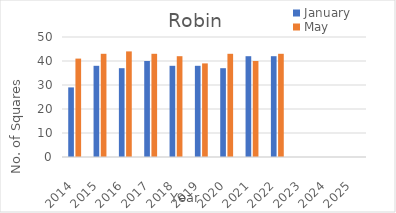
| Category | January | May |
|---|---|---|
| 2014.0 | 29 | 41 |
| 2015.0 | 38 | 43 |
| 2016.0 | 37 | 44 |
| 2017.0 | 40 | 43 |
| 2018.0 | 38 | 42 |
| 2019.0 | 38 | 39 |
| 2020.0 | 37 | 43 |
| 2021.0 | 42 | 40 |
| 2022.0 | 42 | 43 |
| 2023.0 | 0 | 0 |
| 2024.0 | 0 | 0 |
| 2025.0 | 0 | 0 |